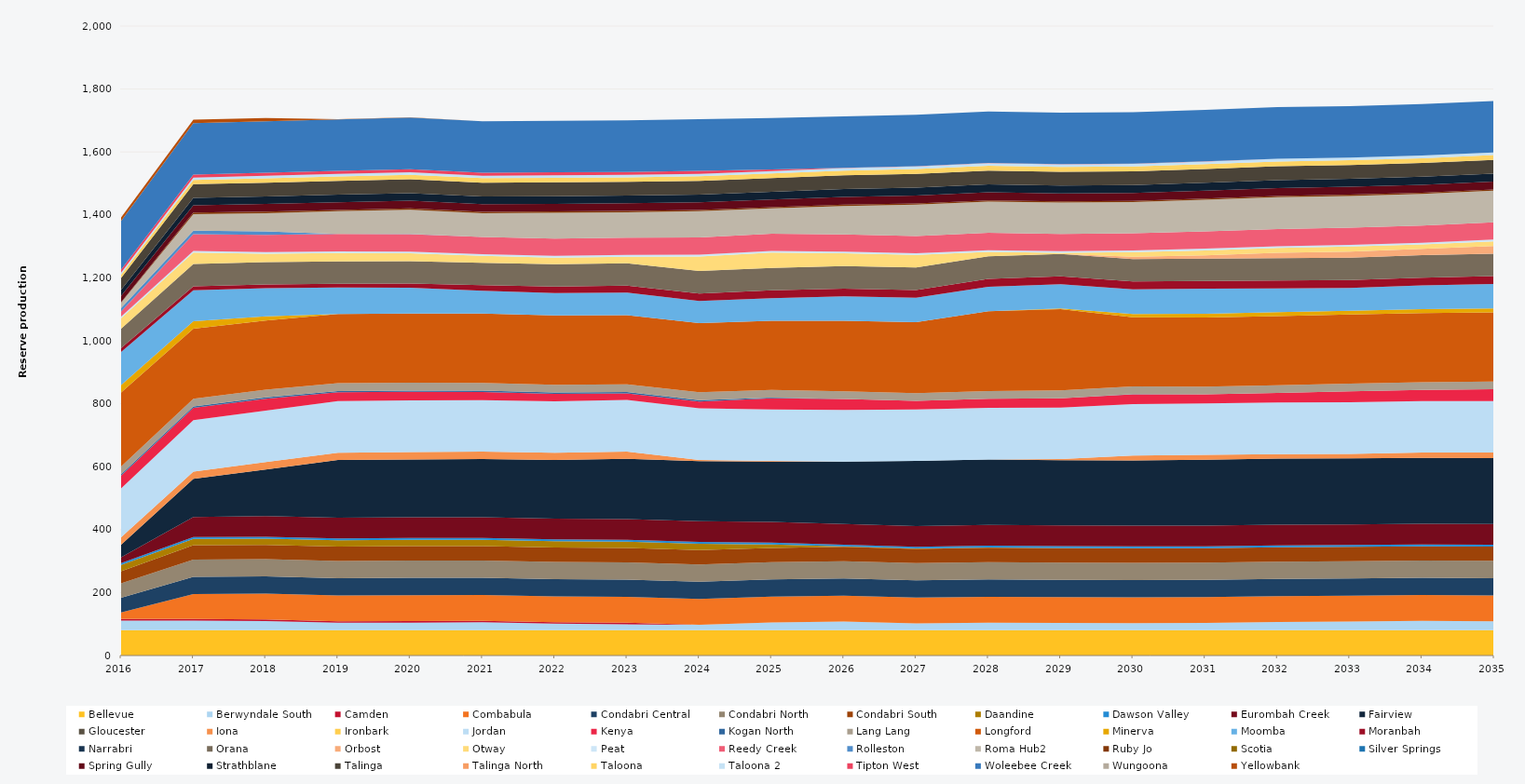
| Category | Bellevue | Berwyndale South | Camden | Combabula | Condabri Central | Condabri North | Condabri South | Daandine | Dawson Valley | Eurombah Creek | Fairview | Gloucester | Iona | Ironbark | Jordan | Kenya | Kogan North | Lang Lang | Longford | Minerva | Moomba | Moranbah | Narrabri | Orana | Orbost | Otway | Peat | Reedy Creek | Rolleston | Roma Hub2 | Ruby Jo | Scotia | Silver Springs | Spring Gully | Strathblane | Talinga | Talinga North | Taloona | Taloona 2 | Tipton West | Woleebee Creek | Wungoona | Yellowbank |
|---|---|---|---|---|---|---|---|---|---|---|---|---|---|---|---|---|---|---|---|---|---|---|---|---|---|---|---|---|---|---|---|---|---|---|---|---|---|---|---|---|---|---|---|
| 2016 | 80.52 | 30.287 | 5 | 21.106 | 46.463 | 45.947 | 38.411 | 20.13 | 5.856 | 18.268 | 40.352 | 0 | 23.12 | 0 | 155.393 | 40.813 | 4.392 | 24.522 | 235.041 | 23.79 | 105 | 12.82 | 0 | 61.561 | 0 | 32.597 | 5.49 | 16.503 | 10.98 | 17.008 | 1.283 | 0 | 0 | 20.164 | 19.464 | 37.065 | 0 | 11.043 | 6.059 | 9.516 | 155.305 | 0 | 10.977 |
| 2017 | 80.3 | 30.472 | 5 | 79.657 | 54.75 | 54.75 | 45.625 | 20.075 | 5.84 | 63.34 | 121.586 | 0 | 23.12 | 0 | 163.348 | 38.912 | 4.38 | 24.455 | 222.562 | 23.725 | 98.848 | 12.277 | 0 | 71.175 | 0 | 36.121 | 5.475 | 53.102 | 10.949 | 52.452 | 4.899 | 0 | 0 | 23.418 | 23.254 | 43.8 | 0 | 13.37 | 7.447 | 9.49 | 163.392 | 0 | 10.944 |
| 2018 | 80.3 | 29.06 | 5 | 82.051 | 54.75 | 54.75 | 45.625 | 20.075 | 5.84 | 65.63 | 148.239 | 0 | 23.12 | 0 | 163.421 | 37.816 | 4.38 | 24.455 | 220 | 13.235 | 89.326 | 11.828 | 0 | 71.175 | 0 | 26.514 | 5.475 | 54.68 | 10.941 | 57.791 | 4.899 | 0 | 0 | 24.213 | 24.089 | 43.8 | 0 | 14.149 | 7.752 | 9.49 | 163.32 | 0 | 10.947 |
| 2019 | 80.3 | 23.668 | 5 | 82.125 | 54.75 | 54.75 | 45.625 | 20.075 | 5.84 | 65.7 | 183.446 | 0 | 23.12 | 0 | 163.781 | 28.017 | 4.38 | 24.455 | 220 | 0 | 84.435 | 11.398 | 0 | 71.175 | 0 | 26.87 | 5.475 | 54.75 | 0.567 | 72.097 | 4.139 | 0 | 0 | 24.246 | 24.234 | 43.8 | 0 | 14.335 | 7.666 | 9.49 | 163.72 | 0 | 0.51 |
| 2020 | 80.52 | 23.953 | 5 | 82.35 | 54.9 | 54.9 | 45.75 | 20.13 | 5.856 | 65.88 | 183.849 | 0 | 23.12 | 0 | 164.13 | 27.352 | 4.392 | 24.522 | 220 | 0 | 82.325 | 12.873 | 0 | 71.37 | 0 | 24.857 | 5.49 | 54.9 | 0.955 | 77.207 | 4.139 | 0 | 0 | 24.254 | 24.193 | 43.92 | 0 | 14.424 | 7.855 | 9.516 | 164.253 | 0 | 1.045 |
| 2021 | 80.3 | 25.128 | 5 | 82.125 | 54.75 | 54.75 | 45.625 | 20.075 | 5.84 | 65.7 | 185.172 | 0 | 23.12 | 0 | 163.643 | 26.227 | 4.38 | 24.455 | 220 | 0 | 72.52 | 17.642 | 0 | 71.175 | 0 | 22.107 | 5.475 | 54.75 | 0 | 75.721 | 4.119 | 0 | 0 | 24.481 | 24.174 | 43.8 | 0 | 14.501 | 7.522 | 9.49 | 163.849 | 0 | 0 |
| 2022 | 80.3 | 20.689 | 5 | 82.125 | 54.75 | 54.75 | 45.625 | 20.075 | 5.84 | 65.7 | 186.113 | 0 | 23.12 | 0 | 163.71 | 23.683 | 4.38 | 24.455 | 220 | 0 | 71.039 | 20.635 | 0 | 71.175 | 0 | 21.197 | 5.475 | 54.75 | 0 | 82.375 | 4.097 | 0 | 0 | 24.119 | 24.5 | 43.8 | 0 | 14.504 | 7.672 | 9.49 | 163.761 | 0 | 0 |
| 2023 | 80.3 | 19.161 | 5 | 82.125 | 54.75 | 54.75 | 45.625 | 20.075 | 5.84 | 65.7 | 191.746 | 0 | 23.12 | 0 | 163.716 | 20.828 | 4.38 | 24.455 | 220 | 0 | 71.356 | 22.362 | 0 | 71.175 | 0 | 20.806 | 5.475 | 54.75 | 0 | 80.988 | 4.075 | 0 | 0 | 24.346 | 24.32 | 43.8 | 0 | 14.491 | 7.506 | 9.49 | 163.733 | 0 | 0 |
| 2024 | 80.52 | 16.788 | 0 | 82.35 | 54.9 | 54.9 | 45.75 | 20.13 | 5.856 | 65.88 | 190.519 | 0 | 3.454 | 0 | 164.155 | 22.097 | 4.392 | 24.522 | 220 | 0 | 69.98 | 24.202 | 0 | 71.37 | 0 | 46.305 | 5.49 | 54.9 | 0 | 83.272 | 4.053 | 0 | 0 | 24.224 | 24.305 | 43.92 | 0 | 14.459 | 7.703 | 9.516 | 164.155 | 0 | 0 |
| 2025 | 80.3 | 24.53 | 0 | 82.125 | 54.75 | 54.75 | 45.625 | 10.682 | 5.84 | 65.7 | 192.099 | 0 | 1.846 | 0 | 163.73 | 35.186 | 2.301 | 24.455 | 220 | 0 | 71.484 | 24.797 | 0 | 71.175 | 0 | 48.95 | 5.475 | 54.75 | 0 | 79.998 | 4.031 | 0 | 0 | 24.322 | 24.302 | 43.8 | 0 | 14.498 | 7.801 | 5.183 | 163.675 | 0 | 0 |
| 2026 | 80.3 | 27.997 | 0 | 82.125 | 54.75 | 54.75 | 45.625 | 1.008 | 5.84 | 65.7 | 198.286 | 0 | 0 | 0 | 163.652 | 34.976 | 0.168 | 24.455 | 224.306 | 0 | 77.14 | 24.82 | 0 | 71.175 | 0 | 40.833 | 5.475 | 54.75 | 0 | 90.321 | 4.008 | 0 | 0 | 24.875 | 24.828 | 43.8 | 0 | 15.044 | 8.086 | 0.424 | 163.732 | 0 | 0 |
| 2027 | 80.3 | 21.529 | 0 | 82.125 | 54.75 | 54.75 | 45.625 | 0.819 | 5.84 | 65.7 | 207.017 | 0 | 0 | 0 | 163.653 | 27.155 | 0.224 | 24.455 | 225.285 | 0 | 77.527 | 24.82 | 0 | 71.175 | 0 | 40.078 | 5.475 | 54.75 | 0 | 99.69 | 3.986 | 0 | 0 | 25.033 | 25.049 | 43.8 | 0 | 15.214 | 8.296 | 0.557 | 163.709 | 0 | 0 |
| 2028 | 80.52 | 23.726 | 0 | 82.35 | 54.9 | 54.9 | 45.75 | 0.862 | 5.856 | 65.88 | 208.379 | 0 | 0 | 0 | 164.117 | 28.426 | 0.207 | 24.522 | 253.259 | 0 | 78.302 | 24.888 | 0 | 71.37 | 0 | 14.372 | 5.49 | 54.9 | 0 | 99.377 | 3.964 | 0 | 0 | 25.234 | 25.157 | 43.92 | 0 | 15.297 | 8.353 | 0.532 | 164.104 | 0 | 0 |
| 2029 | 80.3 | 23.158 | 0 | 82.125 | 54.75 | 54.75 | 45.625 | 1.033 | 5.84 | 65.7 | 207.133 | 0 | 3.678 | 0 | 163.734 | 29.62 | 0.189 | 24.455 | 258.654 | 2.252 | 77 | 24.82 | 0 | 71.175 | 0 | 3.338 | 5.475 | 54.75 | 0 | 99.573 | 3.942 | 0 | 0 | 25.181 | 25.185 | 43.8 | 0 | 15.315 | 8.395 | 0.378 | 163.584 | 0 | 0 |
| 2030 | 80.3 | 22.546 | 0 | 82.125 | 54.75 | 54.75 | 45.625 | 0.971 | 5.84 | 65.7 | 207.145 | 0 | 15.755 | 0 | 163.672 | 31.055 | 0.154 | 24.455 | 220 | 10.464 | 78.19 | 24.82 | 0 | 71.175 | 7.74 | 14.365 | 5.475 | 54.75 | 0 | 98.689 | 3.92 | 0 | 0 | 25.147 | 25.124 | 43.8 | 0 | 15.307 | 8.343 | 0.475 | 163.625 | 0 | 0 |
| 2031 | 80.3 | 23.303 | 0 | 82.125 | 54.75 | 54.75 | 45.625 | 0.208 | 5.84 | 65.7 | 209.49 | 0 | 15.234 | 0 | 163.729 | 28.615 | 0.075 | 24.455 | 220 | 11.304 | 79.894 | 24.82 | 0 | 71.175 | 10.074 | 15.878 | 5.475 | 54.75 | 0.01 | 100.424 | 3.898 | 0.03 | 0 | 25.185 | 25.185 | 43.8 | 0 | 15.329 | 8.387 | 0.112 | 163.546 | 0 | 0 |
| 2032 | 80.52 | 25.635 | 0 | 82.35 | 54.9 | 54.9 | 45.75 | 0.106 | 5.856 | 65.88 | 209.977 | 0 | 13.955 | 0 | 164.123 | 30.086 | 0.029 | 24.522 | 220 | 12.132 | 75.853 | 24.888 | 0 | 71.37 | 16.732 | 15.368 | 5.49 | 54.9 | 0 | 100.896 | 3.876 | 0 | 0 | 25.254 | 25.254 | 43.92 | 0 | 15.372 | 8.418 | 0.07 | 164.011 | 0 | 0 |
| 2033 | 80.3 | 27.546 | 0 | 82.125 | 54.75 | 54.75 | 45.625 | 0.11 | 5.84 | 65.7 | 209.616 | 0 | 14.389 | 0 | 163.626 | 35.028 | 0.028 | 24.455 | 220 | 11.368 | 72.807 | 24.82 | 0 | 71.175 | 19.136 | 16.361 | 5.475 | 54.75 | 0 | 100.583 | 3.854 | 0 | 0 | 25.185 | 25.185 | 43.8 | 0 | 15.33 | 8.395 | 0.052 | 163.605 | 0 | 0 |
| 2034 | 80.3 | 29.561 | 0 | 82.125 | 54.75 | 54.75 | 45.625 | 0.128 | 5.84 | 65.7 | 209.5 | 0 | 16.648 | 0 | 163.608 | 35.213 | 0.041 | 24.455 | 220 | 12.463 | 75.152 | 24.82 | 0 | 71.175 | 20.354 | 13.738 | 5.475 | 54.75 | 0 | 100.73 | 3.831 | 0.009 | 0 | 25.185 | 25.185 | 43.8 | 0 | 15.33 | 8.395 | 0.092 | 163.601 | 0 | 0 |
| 2035 | 80.3 | 28.744 | 0 | 82.125 | 54.75 | 54.75 | 45.625 | 0.215 | 5.84 | 65.7 | 209.5 | 0 | 17.322 | 0 | 163.564 | 37.54 | 0.04 | 24.455 | 220 | 12.332 | 77.951 | 24.82 | 0 | 71.175 | 24.374 | 14.922 | 5.475 | 54.75 | 0 | 100.83 | 3.604 | 0.03 | 0 | 25.185 | 25.185 | 43.8 | 0 | 15.33 | 8.395 | 0.104 | 163.522 | 0 | 0 |